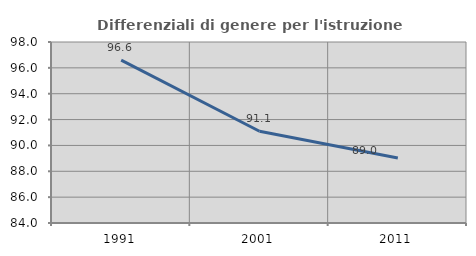
| Category | Differenziali di genere per l'istruzione superiore |
|---|---|
| 1991.0 | 96.594 |
| 2001.0 | 91.099 |
| 2011.0 | 89.03 |